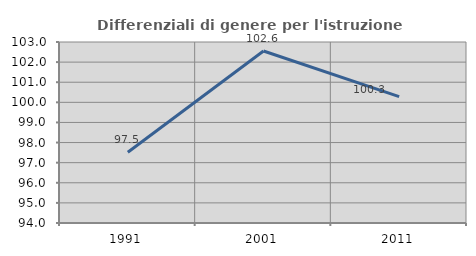
| Category | Differenziali di genere per l'istruzione superiore |
|---|---|
| 1991.0 | 97.521 |
| 2001.0 | 102.552 |
| 2011.0 | 100.281 |